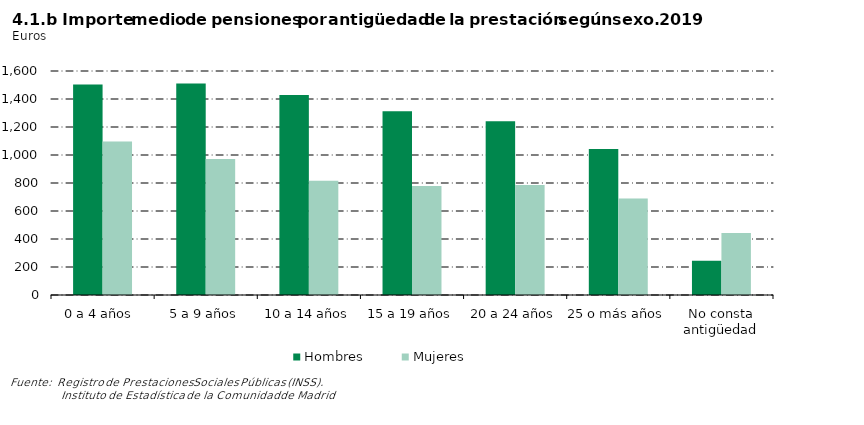
| Category | Hombres | Mujeres |
|---|---|---|
| 0 a 4 años  | 1502.978 | 1096.396 |
| 5 a 9 años | 1510.747 | 971.086 |
| 10 a 14 años | 1428.407 | 816.152 |
| 15 a 19 años | 1311.707 | 779.034 |
| 20 a 24 años | 1241.573 | 785.723 |
| 25 o más años | 1043.225 | 689.331 |
| No consta antigüedad | 243.891 | 442.733 |